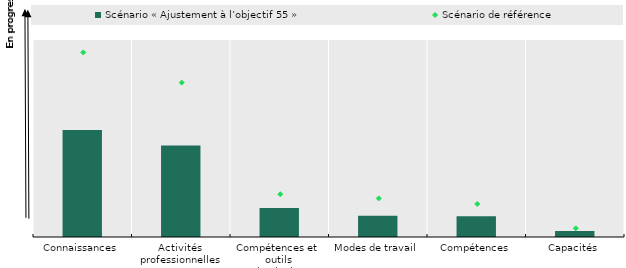
| Category | Scénario « Ajustement à l’objectif 55 » |
|---|---|
| Connaissances | 1628.695 |
| Activités 
professionnelles | 1394.725 |
| Compétences et 
outils technologiques | 441.978 |
| Modes de travail | 324.481 |
| Compétences | 315.479 |
| Capacités | 89.478 |